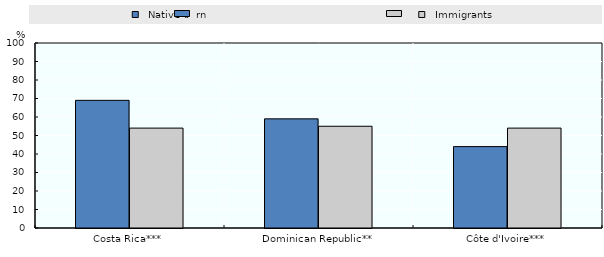
| Category |   Native-born |   Immigrants |
|---|---|---|
| Costa Rica*** | 69 | 54 |
| Dominican Republic** | 59 | 55 |
| Côte d'Ivoire*** | 44 | 54 |